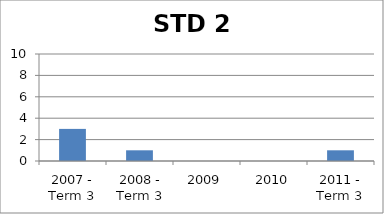
| Category | Rank |
|---|---|
| 2007 - Term 3 | 3 |
| 2008 - Term 3 | 1 |
| 2009 | 0 |
| 2010 | 0 |
| 2011 - Term 3 | 1 |